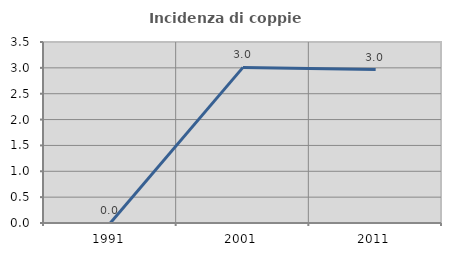
| Category | Incidenza di coppie miste |
|---|---|
| 1991.0 | 0 |
| 2001.0 | 3.009 |
| 2011.0 | 2.966 |